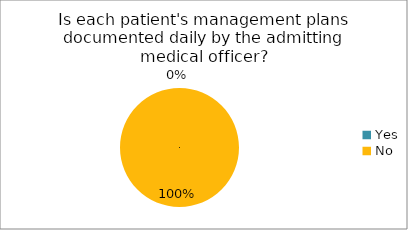
| Category | Is each patient's management plans documented daily by the admitting medical officer? |
|---|---|
| Yes | 0 |
| No | 1 |